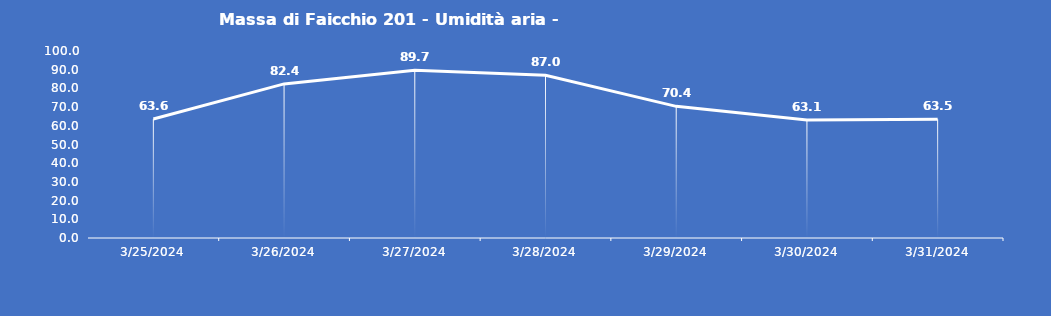
| Category | Massa di Faicchio 201 - Umidità aria - Grezzo (%) |
|---|---|
| 3/25/24 | 63.6 |
| 3/26/24 | 82.4 |
| 3/27/24 | 89.7 |
| 3/28/24 | 87 |
| 3/29/24 | 70.4 |
| 3/30/24 | 63.1 |
| 3/31/24 | 63.5 |